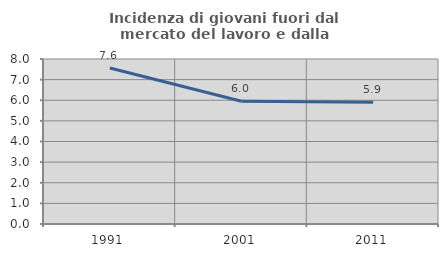
| Category | Incidenza di giovani fuori dal mercato del lavoro e dalla formazione  |
|---|---|
| 1991.0 | 7.567 |
| 2001.0 | 5.953 |
| 2011.0 | 5.907 |